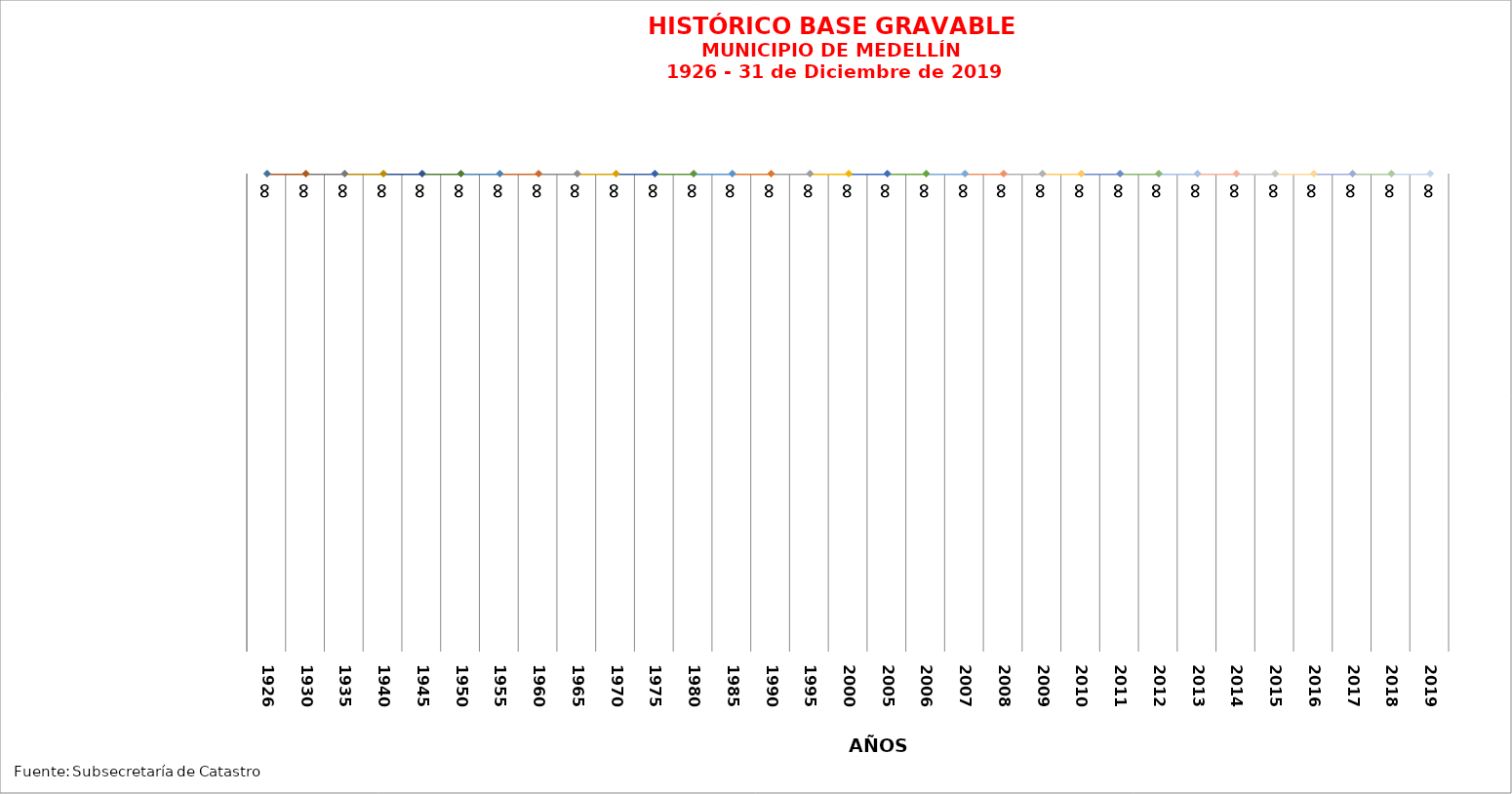
| Category | BASE GRAVABLE |
|---|---|
| 1926.0 | 101594502 |
| 1930.0 | 109999505 |
| 1935.0 | 100504504 |
| 1940.0 | 122443248 |
| 1945.0 | 369222728 |
| 1950.0 | 1032047885 |
| 1955.0 | 1490481970 |
| 1960.0 | 3268665993 |
| 1965.0 | 6894473000 |
| 1970.0 | 13189031000 |
| 1975.0 | 27237658000 |
| 1980.0 | 88056009000 |
| 1985.0 | 372679162000 |
| 1990.0 | 3599131591500 |
| 1995.0 | 6825584021000 |
| 2000.0 | 16046261085100 |
| 2005.0 | 23540394076632 |
| 2006.0 | 29080343156210 |
| 2007.0 | 31607706621907 |
| 2008.0 | 33993242962512 |
| 2009.0 | 36450563896936 |
| 2010.0 | 39324438833246 |
| 2011.0 | 42875678775395 |
| 2012.0 | 45924869601651 |
| 2013.0 | 66668954212000 |
| 2014.0 | 69771753397016 |
| 2015.0 | 76438566747000 |
| 2016.0 | 78657576182616.98 |
| 2017.0 | 81019653525400 |
| 2018.0 | 87072880406839.02 |
| 2019.0 | 92841981852828.98 |